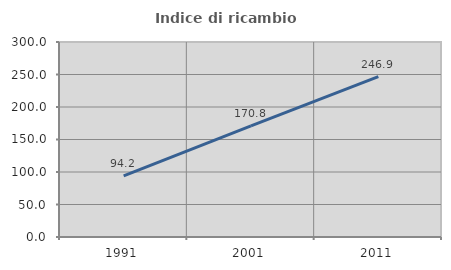
| Category | Indice di ricambio occupazionale  |
|---|---|
| 1991.0 | 94.158 |
| 2001.0 | 170.833 |
| 2011.0 | 246.875 |